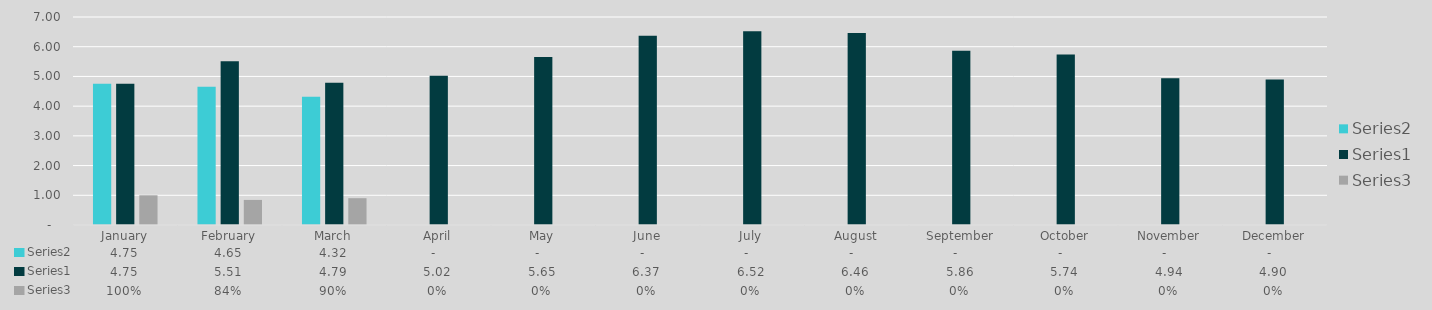
| Category | Series 1 | Series 0 | Series 2 |
|---|---|---|---|
| January | 4.75 | 4.75 | 1 |
| February | 4.65 | 5.51 | 0.844 |
| March | 4.32 | 4.79 | 0.902 |
| April | 0 | 5.02 | 0 |
| May | 0 | 5.65 | 0 |
| June | 0 | 6.37 | 0 |
| July | 0 | 6.52 | 0 |
| August | 0 | 6.46 | 0 |
| September | 0 | 5.86 | 0 |
| October | 0 | 5.74 | 0 |
| November | 0 | 4.94 | 0 |
| December | 0 | 4.9 | 0 |